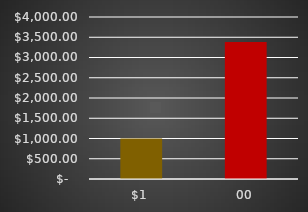
| Category | Series 0 | Series 1 |
|---|---|---|
| 0 | 1000 |  |
| 1 | 3380 |  |